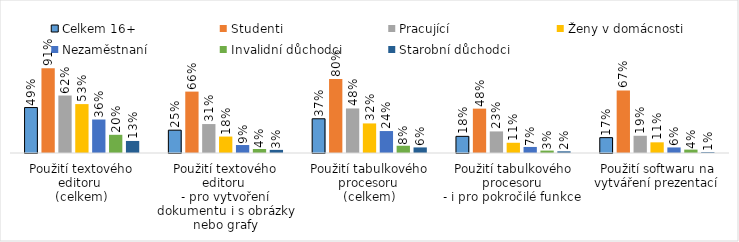
| Category | Celkem 16+ | Studenti | Pracující | Ženy v domácnosti | Nezaměstnaní | Invalidní důchodci | Starobní důchodci |
|---|---|---|---|---|---|---|---|
| Použití textového editoru 
(celkem) | 0.489 | 0.91 | 0.618 | 0.526 | 0.36 | 0.196 | 0.129 |
| Použití textového editoru 
- pro vytvoření dokumentu i s obrázky nebo grafy | 0.246 | 0.66 | 0.311 | 0.177 | 0.086 | 0.043 | 0.034 |
| Použití tabulkového procesoru 
(celkem) | 0.368 | 0.795 | 0.479 | 0.318 | 0.236 | 0.078 | 0.06 |
| Použití tabulkového procesoru 
- i pro pokročilé funkce  | 0.179 | 0.477 | 0.232 | 0.11 | 0.065 | 0.026 | 0.018 |
| Použití softwaru na vytváření prezentací  | 0.165 | 0.672 | 0.185 | 0.115 | 0.06 | 0.037 | 0.009 |